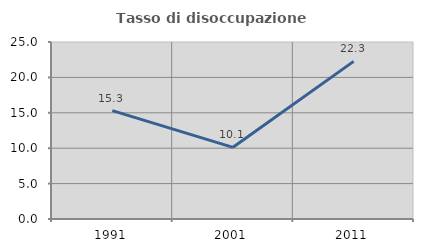
| Category | Tasso di disoccupazione giovanile  |
|---|---|
| 1991.0 | 15.313 |
| 2001.0 | 10.123 |
| 2011.0 | 22.266 |